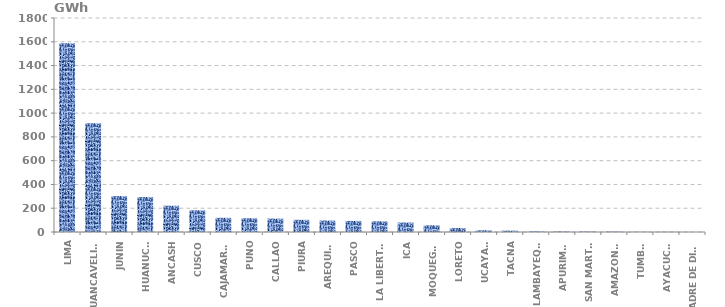
| Category | Series 0 |
|---|---|
| LIMA | 1587.174 |
| HUANCAVELICA | 915.467 |
| JUNIN | 301.941 |
| HUANUCO | 293.739 |
| ANCASH | 221.13 |
| CUSCO | 182.353 |
| CAJAMARCA | 119.399 |
| PUNO | 115.749 |
| CALLAO | 112.652 |
| PIURA | 102.417 |
| AREQUIPA | 96.174 |
| PASCO | 93.249 |
| LA LIBERTAD | 89.884 |
| ICA | 79.605 |
| MOQUEGUA | 56.121 |
| LORETO | 33.7 |
| UCAYALI | 14.447 |
| TACNA | 11.427 |
| LAMBAYEQUE | 5.203 |
| APURIMAC | 4.053 |
| SAN MARTÍN | 3.32 |
| AMAZONAS | 3.108 |
| TUMBES | 1.101 |
| AYACUCHO | 1.025 |
| MADRE DE DIOS | 0.113 |